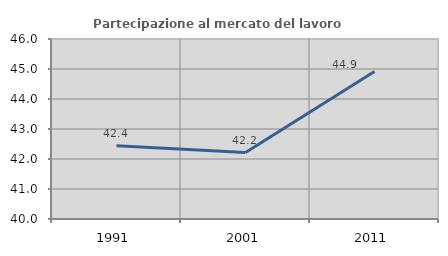
| Category | Partecipazione al mercato del lavoro  femminile |
|---|---|
| 1991.0 | 42.44 |
| 2001.0 | 42.216 |
| 2011.0 | 44.914 |